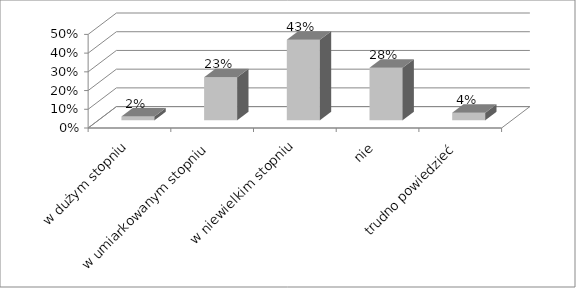
| Category | Series 0 |
|---|---|
| w dużym stopniu | 0.02 |
| w umiarkowanym stopniu | 0.23 |
| w niewielkim stopniu | 0.43 |
| nie | 0.28 |
| trudno powiedzieć | 0.04 |